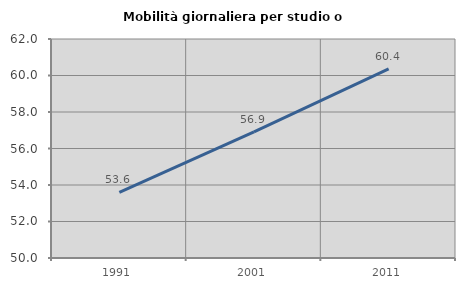
| Category | Mobilità giornaliera per studio o lavoro |
|---|---|
| 1991.0 | 53.599 |
| 2001.0 | 56.915 |
| 2011.0 | 60.367 |